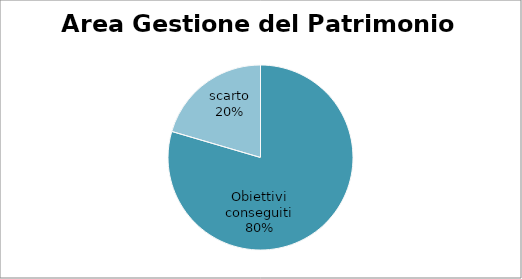
| Category | Series 0 |
|---|---|
| Obiettivi conseguiti | 79.545 |
| scarto | 20.455 |